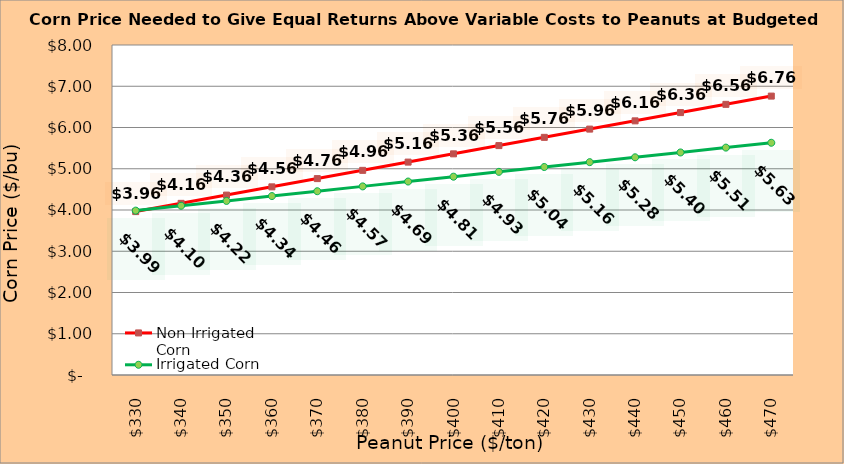
| Category | Non Irrigated Corn | Irrigated Corn |
|---|---|---|
| 330.0 | 3.961 | 3.985 |
| 340.0 | 4.161 | 4.103 |
| 350.0 | 4.361 | 4.22 |
| 360.0 | 4.561 | 4.338 |
| 370.0 | 4.761 | 4.455 |
| 380.0 | 4.961 | 4.573 |
| 390.0 | 5.161 | 4.69 |
| 400.0 | 5.361 | 4.808 |
| 410.0 | 5.561 | 4.925 |
| 420.0 | 5.761 | 5.043 |
| 430.0 | 5.961 | 5.16 |
| 440.0 | 6.161 | 5.278 |
| 450.0 | 6.361 | 5.395 |
| 460.0 | 6.561 | 5.513 |
| 470.0 | 6.761 | 5.63 |